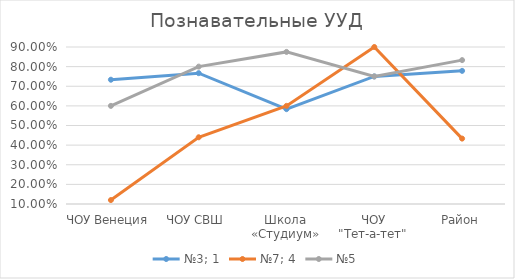
| Category | №3; 1 | №7; 4 | №5 |
|---|---|---|---|
| ЧОУ Венеция | 0.733 | 0.12 | 0.6 |
| ЧОУ СВШ | 0.767 | 0.44 | 0.8 |
| Школа «Студиум» | 0.583 | 0.6 | 0.875 |
| ЧОУ "Тет-а-тет" | 0.75 | 0.9 | 0.75 |
| Район | 0.778 | 0.433 | 0.833 |